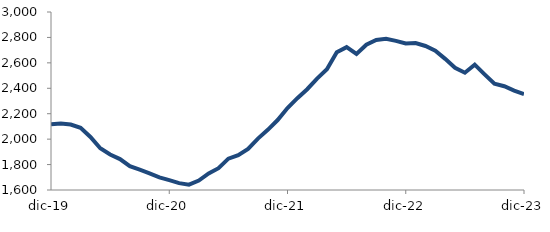
| Category | Series 0 |
|---|---|
| 2019-12-01 | 2116.27 |
| 2020-01-01 | 2123.179 |
| 2020-02-01 | 2115.217 |
| 2020-03-01 | 2088.6 |
| 2020-04-01 | 2017.241 |
| 2020-05-01 | 1928.116 |
| 2020-06-01 | 1878.979 |
| 2020-07-01 | 1843.29 |
| 2020-08-01 | 1787.543 |
| 2020-09-01 | 1760.281 |
| 2020-10-01 | 1731.197 |
| 2020-11-01 | 1698.835 |
| 2020-12-01 | 1677.184 |
| 2021-01-01 | 1654.072 |
| 2021-02-01 | 1641.869 |
| 2021-03-01 | 1673.821 |
| 2021-04-01 | 1730.759 |
| 2021-05-01 | 1771.425 |
| 2021-06-01 | 1846.573 |
| 2021-07-01 | 1874.111 |
| 2021-08-01 | 1922.894 |
| 2021-09-01 | 2004.225 |
| 2021-10-01 | 2073.331 |
| 2021-11-01 | 2150.314 |
| 2021-12-01 | 2244.492 |
| 2022-01-01 | 2321.95 |
| 2022-02-01 | 2392.65 |
| 2022-03-01 | 2476.383 |
| 2022-04-01 | 2549.069 |
| 2022-05-01 | 2683.336 |
| 2022-06-01 | 2723.868 |
| 2022-07-01 | 2670.585 |
| 2022-08-01 | 2742.913 |
| 2022-09-01 | 2780.46 |
| 2022-10-01 | 2788.916 |
| 2022-11-01 | 2772.628 |
| 2022-12-01 | 2752.307 |
| 2023-01-01 | 2755.69 |
| 2023-02-01 | 2732.653 |
| 2023-03-01 | 2696.107 |
| 2023-04-01 | 2631.454 |
| 2023-05-01 | 2561.826 |
| 2023-06-01 | 2522.703 |
| 2023-07-01 | 2586.296 |
| 2023-08-01 | 2509.777 |
| 2023-09-01 | 2436.109 |
| 2023-10-01 | 2416.11 |
| 2023-11-01 | 2381.816 |
| 2023-12-01 | 2354.903 |